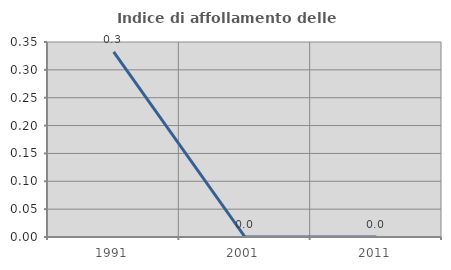
| Category | Indice di affollamento delle abitazioni  |
|---|---|
| 1991.0 | 0.332 |
| 2001.0 | 0 |
| 2011.0 | 0 |